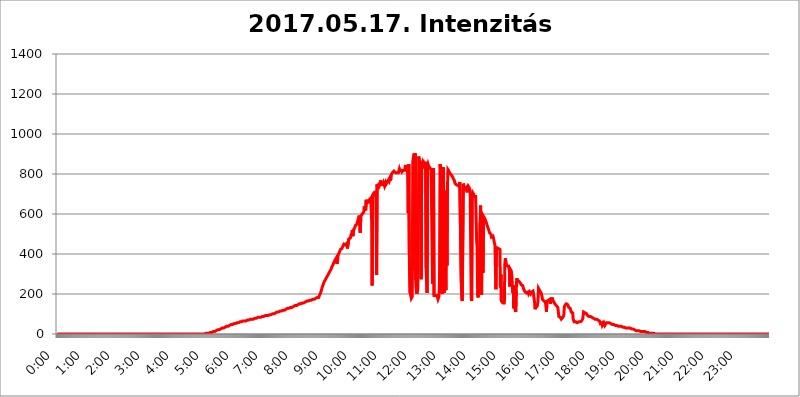
| Category | 2017.05.17. Intenzitás [W/m^2] |
|---|---|
| 0.0 | 0 |
| 0.0006944444444444445 | 0 |
| 0.001388888888888889 | 0 |
| 0.0020833333333333333 | 0 |
| 0.002777777777777778 | 0 |
| 0.003472222222222222 | 0 |
| 0.004166666666666667 | 0 |
| 0.004861111111111111 | 0 |
| 0.005555555555555556 | 0 |
| 0.0062499999999999995 | 0 |
| 0.006944444444444444 | 0 |
| 0.007638888888888889 | 0 |
| 0.008333333333333333 | 0 |
| 0.009027777777777779 | 0 |
| 0.009722222222222222 | 0 |
| 0.010416666666666666 | 0 |
| 0.011111111111111112 | 0 |
| 0.011805555555555555 | 0 |
| 0.012499999999999999 | 0 |
| 0.013194444444444444 | 0 |
| 0.013888888888888888 | 0 |
| 0.014583333333333332 | 0 |
| 0.015277777777777777 | 0 |
| 0.015972222222222224 | 0 |
| 0.016666666666666666 | 0 |
| 0.017361111111111112 | 0 |
| 0.018055555555555557 | 0 |
| 0.01875 | 0 |
| 0.019444444444444445 | 0 |
| 0.02013888888888889 | 0 |
| 0.020833333333333332 | 0 |
| 0.02152777777777778 | 0 |
| 0.022222222222222223 | 0 |
| 0.02291666666666667 | 0 |
| 0.02361111111111111 | 0 |
| 0.024305555555555556 | 0 |
| 0.024999999999999998 | 0 |
| 0.025694444444444447 | 0 |
| 0.02638888888888889 | 0 |
| 0.027083333333333334 | 0 |
| 0.027777777777777776 | 0 |
| 0.02847222222222222 | 0 |
| 0.029166666666666664 | 0 |
| 0.029861111111111113 | 0 |
| 0.030555555555555555 | 0 |
| 0.03125 | 0 |
| 0.03194444444444445 | 0 |
| 0.03263888888888889 | 0 |
| 0.03333333333333333 | 0 |
| 0.034027777777777775 | 0 |
| 0.034722222222222224 | 0 |
| 0.035416666666666666 | 0 |
| 0.036111111111111115 | 0 |
| 0.03680555555555556 | 0 |
| 0.0375 | 0 |
| 0.03819444444444444 | 0 |
| 0.03888888888888889 | 0 |
| 0.03958333333333333 | 0 |
| 0.04027777777777778 | 0 |
| 0.04097222222222222 | 0 |
| 0.041666666666666664 | 0 |
| 0.042361111111111106 | 0 |
| 0.04305555555555556 | 0 |
| 0.043750000000000004 | 0 |
| 0.044444444444444446 | 0 |
| 0.04513888888888889 | 0 |
| 0.04583333333333334 | 0 |
| 0.04652777777777778 | 0 |
| 0.04722222222222222 | 0 |
| 0.04791666666666666 | 0 |
| 0.04861111111111111 | 0 |
| 0.049305555555555554 | 0 |
| 0.049999999999999996 | 0 |
| 0.05069444444444445 | 0 |
| 0.051388888888888894 | 0 |
| 0.052083333333333336 | 0 |
| 0.05277777777777778 | 0 |
| 0.05347222222222222 | 0 |
| 0.05416666666666667 | 0 |
| 0.05486111111111111 | 0 |
| 0.05555555555555555 | 0 |
| 0.05625 | 0 |
| 0.05694444444444444 | 0 |
| 0.057638888888888885 | 0 |
| 0.05833333333333333 | 0 |
| 0.05902777777777778 | 0 |
| 0.059722222222222225 | 0 |
| 0.06041666666666667 | 0 |
| 0.061111111111111116 | 0 |
| 0.06180555555555556 | 0 |
| 0.0625 | 0 |
| 0.06319444444444444 | 0 |
| 0.06388888888888888 | 0 |
| 0.06458333333333334 | 0 |
| 0.06527777777777778 | 0 |
| 0.06597222222222222 | 0 |
| 0.06666666666666667 | 0 |
| 0.06736111111111111 | 0 |
| 0.06805555555555555 | 0 |
| 0.06874999999999999 | 0 |
| 0.06944444444444443 | 0 |
| 0.07013888888888889 | 0 |
| 0.07083333333333333 | 0 |
| 0.07152777777777779 | 0 |
| 0.07222222222222223 | 0 |
| 0.07291666666666667 | 0 |
| 0.07361111111111111 | 0 |
| 0.07430555555555556 | 0 |
| 0.075 | 0 |
| 0.07569444444444444 | 0 |
| 0.0763888888888889 | 0 |
| 0.07708333333333334 | 0 |
| 0.07777777777777778 | 0 |
| 0.07847222222222222 | 0 |
| 0.07916666666666666 | 0 |
| 0.0798611111111111 | 0 |
| 0.08055555555555556 | 0 |
| 0.08125 | 0 |
| 0.08194444444444444 | 0 |
| 0.08263888888888889 | 0 |
| 0.08333333333333333 | 0 |
| 0.08402777777777777 | 0 |
| 0.08472222222222221 | 0 |
| 0.08541666666666665 | 0 |
| 0.08611111111111112 | 0 |
| 0.08680555555555557 | 0 |
| 0.08750000000000001 | 0 |
| 0.08819444444444445 | 0 |
| 0.08888888888888889 | 0 |
| 0.08958333333333333 | 0 |
| 0.09027777777777778 | 0 |
| 0.09097222222222222 | 0 |
| 0.09166666666666667 | 0 |
| 0.09236111111111112 | 0 |
| 0.09305555555555556 | 0 |
| 0.09375 | 0 |
| 0.09444444444444444 | 0 |
| 0.09513888888888888 | 0 |
| 0.09583333333333333 | 0 |
| 0.09652777777777777 | 0 |
| 0.09722222222222222 | 0 |
| 0.09791666666666667 | 0 |
| 0.09861111111111111 | 0 |
| 0.09930555555555555 | 0 |
| 0.09999999999999999 | 0 |
| 0.10069444444444443 | 0 |
| 0.1013888888888889 | 0 |
| 0.10208333333333335 | 0 |
| 0.10277777777777779 | 0 |
| 0.10347222222222223 | 0 |
| 0.10416666666666667 | 0 |
| 0.10486111111111111 | 0 |
| 0.10555555555555556 | 0 |
| 0.10625 | 0 |
| 0.10694444444444444 | 0 |
| 0.1076388888888889 | 0 |
| 0.10833333333333334 | 0 |
| 0.10902777777777778 | 0 |
| 0.10972222222222222 | 0 |
| 0.1111111111111111 | 0 |
| 0.11180555555555556 | 0 |
| 0.11180555555555556 | 0 |
| 0.1125 | 0 |
| 0.11319444444444444 | 0 |
| 0.11388888888888889 | 0 |
| 0.11458333333333333 | 0 |
| 0.11527777777777777 | 0 |
| 0.11597222222222221 | 0 |
| 0.11666666666666665 | 0 |
| 0.1173611111111111 | 0 |
| 0.11805555555555557 | 0 |
| 0.11944444444444445 | 0 |
| 0.12013888888888889 | 0 |
| 0.12083333333333333 | 0 |
| 0.12152777777777778 | 0 |
| 0.12222222222222223 | 0 |
| 0.12291666666666667 | 0 |
| 0.12291666666666667 | 0 |
| 0.12361111111111112 | 0 |
| 0.12430555555555556 | 0 |
| 0.125 | 0 |
| 0.12569444444444444 | 0 |
| 0.12638888888888888 | 0 |
| 0.12708333333333333 | 0 |
| 0.16875 | 0 |
| 0.12847222222222224 | 0 |
| 0.12916666666666668 | 0 |
| 0.12986111111111112 | 0 |
| 0.13055555555555556 | 0 |
| 0.13125 | 0 |
| 0.13194444444444445 | 0 |
| 0.1326388888888889 | 0 |
| 0.13333333333333333 | 0 |
| 0.13402777777777777 | 0 |
| 0.13402777777777777 | 0 |
| 0.13472222222222222 | 0 |
| 0.13541666666666666 | 0 |
| 0.1361111111111111 | 0 |
| 0.13749999999999998 | 0 |
| 0.13819444444444443 | 0 |
| 0.1388888888888889 | 0 |
| 0.13958333333333334 | 0 |
| 0.14027777777777778 | 0 |
| 0.14097222222222222 | 0 |
| 0.14166666666666666 | 0 |
| 0.1423611111111111 | 0 |
| 0.14305555555555557 | 0 |
| 0.14375000000000002 | 0 |
| 0.14444444444444446 | 0 |
| 0.1451388888888889 | 0 |
| 0.1451388888888889 | 0 |
| 0.14652777777777778 | 0 |
| 0.14722222222222223 | 0 |
| 0.14791666666666667 | 0 |
| 0.1486111111111111 | 0 |
| 0.14930555555555555 | 0 |
| 0.15 | 0 |
| 0.15069444444444444 | 0 |
| 0.15138888888888888 | 0 |
| 0.15208333333333332 | 0 |
| 0.15277777777777776 | 0 |
| 0.15347222222222223 | 0 |
| 0.15416666666666667 | 0 |
| 0.15486111111111112 | 0 |
| 0.15555555555555556 | 0 |
| 0.15625 | 0 |
| 0.15694444444444444 | 0 |
| 0.15763888888888888 | 0 |
| 0.15833333333333333 | 0 |
| 0.15902777777777777 | 0 |
| 0.15972222222222224 | 0 |
| 0.16041666666666668 | 0 |
| 0.16111111111111112 | 0 |
| 0.16180555555555556 | 0 |
| 0.1625 | 0 |
| 0.16319444444444445 | 0 |
| 0.1638888888888889 | 0 |
| 0.16458333333333333 | 0 |
| 0.16527777777777777 | 0 |
| 0.16597222222222222 | 0 |
| 0.16666666666666666 | 0 |
| 0.1673611111111111 | 0 |
| 0.16805555555555554 | 0 |
| 0.16874999999999998 | 0 |
| 0.16944444444444443 | 0 |
| 0.17013888888888887 | 0 |
| 0.1708333333333333 | 0 |
| 0.17152777777777775 | 0 |
| 0.17222222222222225 | 0 |
| 0.1729166666666667 | 0 |
| 0.17361111111111113 | 0 |
| 0.17430555555555557 | 0 |
| 0.17500000000000002 | 0 |
| 0.17569444444444446 | 0 |
| 0.1763888888888889 | 0 |
| 0.17708333333333334 | 0 |
| 0.17777777777777778 | 0 |
| 0.17847222222222223 | 0 |
| 0.17916666666666667 | 0 |
| 0.1798611111111111 | 0 |
| 0.18055555555555555 | 0 |
| 0.18125 | 0 |
| 0.18194444444444444 | 0 |
| 0.1826388888888889 | 0 |
| 0.18333333333333335 | 0 |
| 0.1840277777777778 | 0 |
| 0.18472222222222223 | 0 |
| 0.18541666666666667 | 0 |
| 0.18611111111111112 | 0 |
| 0.18680555555555556 | 0 |
| 0.1875 | 0 |
| 0.18819444444444444 | 0 |
| 0.18888888888888888 | 0 |
| 0.18958333333333333 | 0 |
| 0.19027777777777777 | 0 |
| 0.1909722222222222 | 0 |
| 0.19166666666666665 | 0 |
| 0.19236111111111112 | 0 |
| 0.19305555555555554 | 0 |
| 0.19375 | 0 |
| 0.19444444444444445 | 0 |
| 0.1951388888888889 | 0 |
| 0.19583333333333333 | 0 |
| 0.19652777777777777 | 0 |
| 0.19722222222222222 | 0 |
| 0.19791666666666666 | 0 |
| 0.1986111111111111 | 0 |
| 0.19930555555555554 | 0 |
| 0.19999999999999998 | 0 |
| 0.20069444444444443 | 0 |
| 0.20138888888888887 | 0 |
| 0.2020833333333333 | 0 |
| 0.2027777777777778 | 0 |
| 0.2034722222222222 | 0 |
| 0.2041666666666667 | 0 |
| 0.20486111111111113 | 0 |
| 0.20555555555555557 | 0 |
| 0.20625000000000002 | 0 |
| 0.20694444444444446 | 0 |
| 0.2076388888888889 | 3.525 |
| 0.20833333333333334 | 3.525 |
| 0.20902777777777778 | 3.525 |
| 0.20972222222222223 | 3.525 |
| 0.21041666666666667 | 3.525 |
| 0.2111111111111111 | 3.525 |
| 0.21180555555555555 | 3.525 |
| 0.2125 | 3.525 |
| 0.21319444444444444 | 3.525 |
| 0.2138888888888889 | 3.525 |
| 0.21458333333333335 | 7.887 |
| 0.2152777777777778 | 7.887 |
| 0.21597222222222223 | 7.887 |
| 0.21666666666666667 | 7.887 |
| 0.21736111111111112 | 7.887 |
| 0.21805555555555556 | 7.887 |
| 0.21875 | 12.257 |
| 0.21944444444444444 | 12.257 |
| 0.22013888888888888 | 12.257 |
| 0.22083333333333333 | 12.257 |
| 0.22152777777777777 | 16.636 |
| 0.2222222222222222 | 12.257 |
| 0.22291666666666665 | 16.636 |
| 0.2236111111111111 | 16.636 |
| 0.22430555555555556 | 21.024 |
| 0.225 | 21.024 |
| 0.22569444444444445 | 21.024 |
| 0.2263888888888889 | 21.024 |
| 0.22708333333333333 | 21.024 |
| 0.22777777777777777 | 21.024 |
| 0.22847222222222222 | 25.419 |
| 0.22916666666666666 | 25.419 |
| 0.2298611111111111 | 25.419 |
| 0.23055555555555554 | 25.419 |
| 0.23124999999999998 | 29.823 |
| 0.23194444444444443 | 29.823 |
| 0.23263888888888887 | 29.823 |
| 0.2333333333333333 | 29.823 |
| 0.2340277777777778 | 29.823 |
| 0.2347222222222222 | 34.234 |
| 0.2354166666666667 | 34.234 |
| 0.23611111111111113 | 34.234 |
| 0.23680555555555557 | 38.653 |
| 0.23750000000000002 | 38.653 |
| 0.23819444444444446 | 38.653 |
| 0.2388888888888889 | 38.653 |
| 0.23958333333333334 | 38.653 |
| 0.24027777777777778 | 38.653 |
| 0.24097222222222223 | 43.079 |
| 0.24166666666666667 | 43.079 |
| 0.2423611111111111 | 43.079 |
| 0.24305555555555555 | 43.079 |
| 0.24375 | 47.511 |
| 0.24444444444444446 | 47.511 |
| 0.24513888888888888 | 47.511 |
| 0.24583333333333335 | 47.511 |
| 0.2465277777777778 | 47.511 |
| 0.24722222222222223 | 47.511 |
| 0.24791666666666667 | 51.951 |
| 0.24861111111111112 | 51.951 |
| 0.24930555555555556 | 51.951 |
| 0.25 | 51.951 |
| 0.25069444444444444 | 56.398 |
| 0.2513888888888889 | 56.398 |
| 0.2520833333333333 | 56.398 |
| 0.25277777777777777 | 56.398 |
| 0.2534722222222222 | 56.398 |
| 0.25416666666666665 | 56.398 |
| 0.2548611111111111 | 56.398 |
| 0.2555555555555556 | 56.398 |
| 0.25625000000000003 | 60.85 |
| 0.2569444444444445 | 60.85 |
| 0.2576388888888889 | 60.85 |
| 0.25833333333333336 | 60.85 |
| 0.2590277777777778 | 60.85 |
| 0.25972222222222224 | 65.31 |
| 0.2604166666666667 | 65.31 |
| 0.2611111111111111 | 65.31 |
| 0.26180555555555557 | 65.31 |
| 0.2625 | 65.31 |
| 0.26319444444444445 | 65.31 |
| 0.2638888888888889 | 65.31 |
| 0.26458333333333334 | 65.31 |
| 0.2652777777777778 | 65.31 |
| 0.2659722222222222 | 69.775 |
| 0.26666666666666666 | 69.775 |
| 0.2673611111111111 | 69.775 |
| 0.26805555555555555 | 69.775 |
| 0.26875 | 69.775 |
| 0.26944444444444443 | 69.775 |
| 0.2701388888888889 | 69.775 |
| 0.2708333333333333 | 74.246 |
| 0.27152777777777776 | 74.246 |
| 0.2722222222222222 | 74.246 |
| 0.27291666666666664 | 74.246 |
| 0.2736111111111111 | 74.246 |
| 0.2743055555555555 | 74.246 |
| 0.27499999999999997 | 74.246 |
| 0.27569444444444446 | 74.246 |
| 0.27638888888888885 | 78.722 |
| 0.27708333333333335 | 78.722 |
| 0.2777777777777778 | 78.722 |
| 0.27847222222222223 | 78.722 |
| 0.2791666666666667 | 78.722 |
| 0.2798611111111111 | 78.722 |
| 0.28055555555555556 | 83.205 |
| 0.28125 | 83.205 |
| 0.28194444444444444 | 83.205 |
| 0.2826388888888889 | 83.205 |
| 0.2833333333333333 | 83.205 |
| 0.28402777777777777 | 83.205 |
| 0.2847222222222222 | 83.205 |
| 0.28541666666666665 | 83.205 |
| 0.28611111111111115 | 83.205 |
| 0.28680555555555554 | 87.692 |
| 0.28750000000000003 | 87.692 |
| 0.2881944444444445 | 87.692 |
| 0.2888888888888889 | 87.692 |
| 0.28958333333333336 | 87.692 |
| 0.2902777777777778 | 87.692 |
| 0.29097222222222224 | 92.184 |
| 0.2916666666666667 | 92.184 |
| 0.2923611111111111 | 92.184 |
| 0.29305555555555557 | 92.184 |
| 0.29375 | 92.184 |
| 0.29444444444444445 | 92.184 |
| 0.2951388888888889 | 92.184 |
| 0.29583333333333334 | 92.184 |
| 0.2965277777777778 | 92.184 |
| 0.2972222222222222 | 96.682 |
| 0.29791666666666666 | 96.682 |
| 0.2986111111111111 | 96.682 |
| 0.29930555555555555 | 96.682 |
| 0.3 | 96.682 |
| 0.30069444444444443 | 96.682 |
| 0.3013888888888889 | 101.184 |
| 0.3020833333333333 | 101.184 |
| 0.30277777777777776 | 101.184 |
| 0.3034722222222222 | 101.184 |
| 0.30416666666666664 | 101.184 |
| 0.3048611111111111 | 101.184 |
| 0.3055555555555555 | 105.69 |
| 0.30624999999999997 | 105.69 |
| 0.3069444444444444 | 105.69 |
| 0.3076388888888889 | 105.69 |
| 0.30833333333333335 | 110.201 |
| 0.3090277777777778 | 110.201 |
| 0.30972222222222223 | 110.201 |
| 0.3104166666666667 | 110.201 |
| 0.3111111111111111 | 110.201 |
| 0.31180555555555556 | 110.201 |
| 0.3125 | 114.716 |
| 0.31319444444444444 | 114.716 |
| 0.3138888888888889 | 114.716 |
| 0.3145833333333333 | 114.716 |
| 0.31527777777777777 | 114.716 |
| 0.3159722222222222 | 114.716 |
| 0.31666666666666665 | 119.235 |
| 0.31736111111111115 | 119.235 |
| 0.31805555555555554 | 119.235 |
| 0.31875000000000003 | 119.235 |
| 0.3194444444444445 | 119.235 |
| 0.3201388888888889 | 123.758 |
| 0.32083333333333336 | 123.758 |
| 0.3215277777777778 | 123.758 |
| 0.32222222222222224 | 123.758 |
| 0.3229166666666667 | 128.284 |
| 0.3236111111111111 | 128.284 |
| 0.32430555555555557 | 128.284 |
| 0.325 | 128.284 |
| 0.32569444444444445 | 128.284 |
| 0.3263888888888889 | 128.284 |
| 0.32708333333333334 | 132.814 |
| 0.3277777777777778 | 132.814 |
| 0.3284722222222222 | 132.814 |
| 0.32916666666666666 | 132.814 |
| 0.3298611111111111 | 137.347 |
| 0.33055555555555555 | 137.347 |
| 0.33125 | 137.347 |
| 0.33194444444444443 | 137.347 |
| 0.3326388888888889 | 137.347 |
| 0.3333333333333333 | 141.884 |
| 0.3340277777777778 | 141.884 |
| 0.3347222222222222 | 141.884 |
| 0.3354166666666667 | 141.884 |
| 0.3361111111111111 | 146.423 |
| 0.3368055555555556 | 146.423 |
| 0.33749999999999997 | 146.423 |
| 0.33819444444444446 | 146.423 |
| 0.33888888888888885 | 146.423 |
| 0.33958333333333335 | 150.964 |
| 0.34027777777777773 | 150.964 |
| 0.34097222222222223 | 150.964 |
| 0.3416666666666666 | 150.964 |
| 0.3423611111111111 | 150.964 |
| 0.3430555555555555 | 155.509 |
| 0.34375 | 155.509 |
| 0.3444444444444445 | 155.509 |
| 0.3451388888888889 | 155.509 |
| 0.3458333333333334 | 155.509 |
| 0.34652777777777777 | 155.509 |
| 0.34722222222222227 | 160.056 |
| 0.34791666666666665 | 160.056 |
| 0.34861111111111115 | 160.056 |
| 0.34930555555555554 | 160.056 |
| 0.35000000000000003 | 164.605 |
| 0.3506944444444444 | 164.605 |
| 0.3513888888888889 | 164.605 |
| 0.3520833333333333 | 164.605 |
| 0.3527777777777778 | 164.605 |
| 0.3534722222222222 | 164.605 |
| 0.3541666666666667 | 169.156 |
| 0.3548611111111111 | 169.156 |
| 0.35555555555555557 | 169.156 |
| 0.35625 | 169.156 |
| 0.35694444444444445 | 173.709 |
| 0.3576388888888889 | 173.709 |
| 0.35833333333333334 | 173.709 |
| 0.3590277777777778 | 173.709 |
| 0.3597222222222222 | 173.709 |
| 0.36041666666666666 | 173.709 |
| 0.3611111111111111 | 178.264 |
| 0.36180555555555555 | 178.264 |
| 0.3625 | 178.264 |
| 0.36319444444444443 | 178.264 |
| 0.3638888888888889 | 178.264 |
| 0.3645833333333333 | 182.82 |
| 0.3652777777777778 | 182.82 |
| 0.3659722222222222 | 182.82 |
| 0.3666666666666667 | 182.82 |
| 0.3673611111111111 | 187.378 |
| 0.3680555555555556 | 196.497 |
| 0.36874999999999997 | 201.058 |
| 0.36944444444444446 | 205.62 |
| 0.37013888888888885 | 214.746 |
| 0.37083333333333335 | 223.873 |
| 0.37152777777777773 | 233 |
| 0.37222222222222223 | 237.564 |
| 0.3729166666666666 | 246.689 |
| 0.3736111111111111 | 251.251 |
| 0.3743055555555555 | 260.373 |
| 0.375 | 264.932 |
| 0.3756944444444445 | 269.49 |
| 0.3763888888888889 | 274.047 |
| 0.3770833333333334 | 278.603 |
| 0.37777777777777777 | 283.156 |
| 0.37847222222222227 | 287.709 |
| 0.37916666666666665 | 292.259 |
| 0.37986111111111115 | 296.808 |
| 0.38055555555555554 | 301.354 |
| 0.38125000000000003 | 305.898 |
| 0.3819444444444444 | 310.44 |
| 0.3826388888888889 | 314.98 |
| 0.3833333333333333 | 319.517 |
| 0.3840277777777778 | 324.052 |
| 0.3847222222222222 | 328.584 |
| 0.3854166666666667 | 337.639 |
| 0.3861111111111111 | 342.162 |
| 0.38680555555555557 | 346.682 |
| 0.3875 | 351.198 |
| 0.38819444444444445 | 360.221 |
| 0.3888888888888889 | 364.728 |
| 0.38958333333333334 | 369.23 |
| 0.3902777777777778 | 373.729 |
| 0.3909722222222222 | 378.224 |
| 0.39166666666666666 | 378.224 |
| 0.3923611111111111 | 351.198 |
| 0.39305555555555555 | 360.221 |
| 0.39375 | 387.202 |
| 0.39444444444444443 | 400.638 |
| 0.3951388888888889 | 405.108 |
| 0.3958333333333333 | 409.574 |
| 0.3965277777777778 | 414.035 |
| 0.3972222222222222 | 422.943 |
| 0.3979166666666667 | 422.943 |
| 0.3986111111111111 | 422.943 |
| 0.3993055555555556 | 427.39 |
| 0.39999999999999997 | 431.833 |
| 0.40069444444444446 | 440.702 |
| 0.40138888888888885 | 440.702 |
| 0.40208333333333335 | 449.551 |
| 0.40277777777777773 | 445.129 |
| 0.40347222222222223 | 449.551 |
| 0.4041666666666666 | 445.129 |
| 0.4048611111111111 | 449.551 |
| 0.4055555555555555 | 449.551 |
| 0.40625 | 453.968 |
| 0.4069444444444445 | 427.39 |
| 0.4076388888888889 | 431.833 |
| 0.4083333333333334 | 422.943 |
| 0.40902777777777777 | 475.972 |
| 0.40972222222222227 | 471.582 |
| 0.41041666666666665 | 475.972 |
| 0.41111111111111115 | 480.356 |
| 0.41180555555555554 | 493.475 |
| 0.41250000000000003 | 497.836 |
| 0.4131944444444444 | 506.542 |
| 0.4138888888888889 | 519.555 |
| 0.4145833333333333 | 489.108 |
| 0.4152777777777778 | 489.108 |
| 0.4159722222222222 | 523.88 |
| 0.4166666666666667 | 523.88 |
| 0.4173611111111111 | 532.513 |
| 0.41805555555555557 | 541.121 |
| 0.41875 | 545.416 |
| 0.41944444444444445 | 545.416 |
| 0.4201388888888889 | 549.704 |
| 0.42083333333333334 | 558.261 |
| 0.4215277777777778 | 566.793 |
| 0.4222222222222222 | 575.299 |
| 0.42291666666666666 | 583.779 |
| 0.4236111111111111 | 592.233 |
| 0.42430555555555555 | 596.45 |
| 0.425 | 506.542 |
| 0.42569444444444443 | 583.779 |
| 0.4263888888888889 | 592.233 |
| 0.4270833333333333 | 592.233 |
| 0.4277777777777778 | 600.661 |
| 0.4284722222222222 | 600.661 |
| 0.4291666666666667 | 600.661 |
| 0.4298611111111111 | 609.062 |
| 0.4305555555555556 | 638.256 |
| 0.43124999999999997 | 634.105 |
| 0.43194444444444446 | 634.105 |
| 0.43263888888888885 | 617.436 |
| 0.43333333333333335 | 671.22 |
| 0.43402777777777773 | 654.791 |
| 0.43472222222222223 | 658.909 |
| 0.4354166666666666 | 658.909 |
| 0.4361111111111111 | 658.909 |
| 0.4368055555555555 | 663.019 |
| 0.4375 | 671.22 |
| 0.4381944444444445 | 671.22 |
| 0.4388888888888889 | 671.22 |
| 0.4395833333333334 | 679.395 |
| 0.44027777777777777 | 625.784 |
| 0.44097222222222227 | 566.793 |
| 0.44166666666666665 | 242.127 |
| 0.44236111111111115 | 695.666 |
| 0.44305555555555554 | 695.666 |
| 0.44375000000000003 | 703.762 |
| 0.4444444444444444 | 703.762 |
| 0.4451388888888889 | 699.717 |
| 0.4458333333333333 | 695.666 |
| 0.4465277777777778 | 699.717 |
| 0.4472222222222222 | 715.858 |
| 0.4479166666666667 | 296.808 |
| 0.4486111111111111 | 747.834 |
| 0.44930555555555557 | 727.896 |
| 0.45 | 731.896 |
| 0.45069444444444445 | 735.89 |
| 0.4513888888888889 | 755.766 |
| 0.45208333333333334 | 747.834 |
| 0.4527777777777778 | 747.834 |
| 0.4534722222222222 | 767.62 |
| 0.45416666666666666 | 755.766 |
| 0.4548611111111111 | 747.834 |
| 0.45555555555555555 | 747.834 |
| 0.45625 | 743.859 |
| 0.45694444444444443 | 747.834 |
| 0.4576388888888889 | 755.766 |
| 0.4583333333333333 | 751.803 |
| 0.4590277777777778 | 739.877 |
| 0.4597222222222222 | 743.859 |
| 0.4604166666666667 | 755.766 |
| 0.4611111111111111 | 747.834 |
| 0.4618055555555556 | 751.803 |
| 0.46249999999999997 | 751.803 |
| 0.46319444444444446 | 759.723 |
| 0.46388888888888885 | 767.62 |
| 0.46458333333333335 | 763.674 |
| 0.46527777777777773 | 775.492 |
| 0.46597222222222223 | 767.62 |
| 0.4666666666666666 | 775.492 |
| 0.4673611111111111 | 767.62 |
| 0.4680555555555555 | 779.42 |
| 0.46875 | 798.974 |
| 0.4694444444444445 | 802.868 |
| 0.4701388888888889 | 806.757 |
| 0.4708333333333334 | 810.641 |
| 0.47152777777777777 | 810.641 |
| 0.47222222222222227 | 814.519 |
| 0.47291666666666665 | 814.519 |
| 0.47361111111111115 | 810.641 |
| 0.47430555555555554 | 806.757 |
| 0.47500000000000003 | 802.868 |
| 0.4756944444444444 | 810.641 |
| 0.4763888888888889 | 806.757 |
| 0.4770833333333333 | 806.757 |
| 0.4777777777777778 | 810.641 |
| 0.4784722222222222 | 806.757 |
| 0.4791666666666667 | 802.868 |
| 0.4798611111111111 | 826.123 |
| 0.48055555555555557 | 818.392 |
| 0.48125 | 822.26 |
| 0.48194444444444445 | 822.26 |
| 0.4826388888888889 | 818.392 |
| 0.48333333333333334 | 810.641 |
| 0.4840277777777778 | 806.757 |
| 0.4847222222222222 | 810.641 |
| 0.48541666666666666 | 818.392 |
| 0.4861111111111111 | 822.26 |
| 0.48680555555555555 | 822.26 |
| 0.4875 | 818.392 |
| 0.48819444444444443 | 845.365 |
| 0.4888888888888889 | 829.981 |
| 0.4895833333333333 | 826.123 |
| 0.4902777777777778 | 829.981 |
| 0.4909722222222222 | 814.519 |
| 0.4916666666666667 | 826.123 |
| 0.4923611111111111 | 604.864 |
| 0.4930555555555556 | 849.199 |
| 0.49374999999999997 | 405.108 |
| 0.49444444444444446 | 210.182 |
| 0.49513888888888885 | 210.182 |
| 0.49583333333333335 | 191.937 |
| 0.49652777777777773 | 178.264 |
| 0.49722222222222223 | 178.264 |
| 0.4979166666666666 | 187.378 |
| 0.4986111111111111 | 860.676 |
| 0.4993055555555555 | 879.719 |
| 0.5 | 883.516 |
| 0.5006944444444444 | 902.447 |
| 0.5013888888888889 | 314.98 |
| 0.5020833333333333 | 902.447 |
| 0.5027777777777778 | 269.49 |
| 0.5034722222222222 | 219.309 |
| 0.5041666666666667 | 201.058 |
| 0.5048611111111111 | 205.62 |
| 0.5055555555555555 | 219.309 |
| 0.50625 | 314.98 |
| 0.5069444444444444 | 887.309 |
| 0.5076388888888889 | 872.114 |
| 0.5083333333333333 | 868.305 |
| 0.5090277777777777 | 856.855 |
| 0.5097222222222222 | 849.199 |
| 0.5104166666666666 | 274.047 |
| 0.5111111111111112 | 860.676 |
| 0.5118055555555555 | 853.029 |
| 0.5125000000000001 | 860.676 |
| 0.5131944444444444 | 860.676 |
| 0.513888888888889 | 845.365 |
| 0.5145833333333333 | 853.029 |
| 0.5152777777777778 | 853.029 |
| 0.5159722222222222 | 841.526 |
| 0.5166666666666667 | 860.676 |
| 0.517361111111111 | 328.584 |
| 0.5180555555555556 | 251.251 |
| 0.5187499999999999 | 205.62 |
| 0.5194444444444445 | 837.682 |
| 0.5201388888888888 | 849.199 |
| 0.5208333333333334 | 841.526 |
| 0.5215277777777778 | 841.526 |
| 0.5222222222222223 | 837.682 |
| 0.5229166666666667 | 829.981 |
| 0.5236111111111111 | 826.123 |
| 0.5243055555555556 | 822.26 |
| 0.525 | 818.392 |
| 0.5256944444444445 | 822.26 |
| 0.5263888888888889 | 251.251 |
| 0.5270833333333333 | 783.342 |
| 0.5277777777777778 | 829.981 |
| 0.5284722222222222 | 191.937 |
| 0.5291666666666667 | 187.378 |
| 0.5298611111111111 | 187.378 |
| 0.5305555555555556 | 191.937 |
| 0.53125 | 196.497 |
| 0.5319444444444444 | 196.497 |
| 0.5326388888888889 | 191.937 |
| 0.5333333333333333 | 182.82 |
| 0.5340277777777778 | 173.709 |
| 0.5347222222222222 | 173.709 |
| 0.5354166666666667 | 187.378 |
| 0.5361111111111111 | 269.49 |
| 0.5368055555555555 | 849.199 |
| 0.5375 | 853.029 |
| 0.5381944444444444 | 826.123 |
| 0.5388888888888889 | 210.182 |
| 0.5395833333333333 | 205.62 |
| 0.5402777777777777 | 201.058 |
| 0.5409722222222222 | 328.584 |
| 0.5416666666666666 | 833.834 |
| 0.5423611111111112 | 833.834 |
| 0.5430555555555555 | 205.62 |
| 0.5437500000000001 | 324.052 |
| 0.5444444444444444 | 296.808 |
| 0.545138888888889 | 219.309 |
| 0.5458333333333333 | 715.858 |
| 0.5465277777777778 | 342.162 |
| 0.5472222222222222 | 719.877 |
| 0.5479166666666667 | 822.26 |
| 0.548611111111111 | 822.26 |
| 0.5493055555555556 | 814.519 |
| 0.5499999999999999 | 810.641 |
| 0.5506944444444445 | 802.868 |
| 0.5513888888888888 | 798.974 |
| 0.5520833333333334 | 798.974 |
| 0.5527777777777778 | 795.074 |
| 0.5534722222222223 | 791.169 |
| 0.5541666666666667 | 791.169 |
| 0.5548611111111111 | 783.342 |
| 0.5555555555555556 | 775.492 |
| 0.55625 | 775.492 |
| 0.5569444444444445 | 767.62 |
| 0.5576388888888889 | 755.766 |
| 0.5583333333333333 | 751.803 |
| 0.5590277777777778 | 747.834 |
| 0.5597222222222222 | 747.834 |
| 0.5604166666666667 | 747.834 |
| 0.5611111111111111 | 743.859 |
| 0.5618055555555556 | 743.859 |
| 0.5625 | 743.859 |
| 0.5631944444444444 | 739.877 |
| 0.5638888888888889 | 747.834 |
| 0.5645833333333333 | 759.723 |
| 0.5652777777777778 | 755.766 |
| 0.5659722222222222 | 759.723 |
| 0.5666666666666667 | 255.813 |
| 0.5673611111111111 | 178.264 |
| 0.5680555555555555 | 164.605 |
| 0.56875 | 164.605 |
| 0.5694444444444444 | 751.803 |
| 0.5701388888888889 | 743.859 |
| 0.5708333333333333 | 731.896 |
| 0.5715277777777777 | 723.889 |
| 0.5722222222222222 | 723.889 |
| 0.5729166666666666 | 727.896 |
| 0.5736111111111112 | 731.896 |
| 0.5743055555555555 | 727.896 |
| 0.5750000000000001 | 707.8 |
| 0.5756944444444444 | 731.896 |
| 0.576388888888889 | 739.877 |
| 0.5770833333333333 | 743.859 |
| 0.5777777777777778 | 731.896 |
| 0.5784722222222222 | 723.889 |
| 0.5791666666666667 | 711.832 |
| 0.579861111111111 | 711.832 |
| 0.5805555555555556 | 178.264 |
| 0.5812499999999999 | 164.605 |
| 0.5819444444444445 | 695.666 |
| 0.5826388888888888 | 707.8 |
| 0.5833333333333334 | 707.8 |
| 0.5840277777777778 | 699.717 |
| 0.5847222222222223 | 687.544 |
| 0.5854166666666667 | 691.608 |
| 0.5861111111111111 | 687.544 |
| 0.5868055555555556 | 687.544 |
| 0.5875 | 683.473 |
| 0.5881944444444445 | 467.187 |
| 0.5888888888888889 | 431.833 |
| 0.5895833333333333 | 191.937 |
| 0.5902777777777778 | 182.82 |
| 0.5909722222222222 | 187.378 |
| 0.5916666666666667 | 264.932 |
| 0.5923611111111111 | 219.309 |
| 0.5930555555555556 | 558.261 |
| 0.59375 | 642.4 |
| 0.5944444444444444 | 638.256 |
| 0.5951388888888889 | 196.497 |
| 0.5958333333333333 | 592.233 |
| 0.5965277777777778 | 346.682 |
| 0.5972222222222222 | 305.898 |
| 0.5979166666666667 | 588.009 |
| 0.5986111111111111 | 592.233 |
| 0.5993055555555555 | 583.779 |
| 0.6 | 575.299 |
| 0.6006944444444444 | 566.793 |
| 0.6013888888888889 | 566.793 |
| 0.6020833333333333 | 553.986 |
| 0.6027777777777777 | 558.261 |
| 0.6034722222222222 | 536.82 |
| 0.6041666666666666 | 536.82 |
| 0.6048611111111112 | 523.88 |
| 0.6055555555555555 | 523.88 |
| 0.6062500000000001 | 506.542 |
| 0.6069444444444444 | 506.542 |
| 0.607638888888889 | 502.192 |
| 0.6083333333333333 | 497.836 |
| 0.6090277777777778 | 484.735 |
| 0.6097222222222222 | 489.108 |
| 0.6104166666666667 | 489.108 |
| 0.611111111111111 | 489.108 |
| 0.6118055555555556 | 480.356 |
| 0.6124999999999999 | 467.187 |
| 0.6131944444444445 | 453.968 |
| 0.6138888888888888 | 445.129 |
| 0.6145833333333334 | 328.584 |
| 0.6152777777777778 | 223.873 |
| 0.6159722222222223 | 436.27 |
| 0.6166666666666667 | 422.943 |
| 0.6173611111111111 | 418.492 |
| 0.6180555555555556 | 418.492 |
| 0.61875 | 427.39 |
| 0.6194444444444445 | 427.39 |
| 0.6201388888888889 | 427.39 |
| 0.6208333333333333 | 422.943 |
| 0.6215277777777778 | 233 |
| 0.6222222222222222 | 296.808 |
| 0.6229166666666667 | 164.605 |
| 0.6236111111111111 | 164.605 |
| 0.6243055555555556 | 160.056 |
| 0.625 | 155.509 |
| 0.6256944444444444 | 155.509 |
| 0.6263888888888889 | 150.964 |
| 0.6270833333333333 | 155.509 |
| 0.6277777777777778 | 351.198 |
| 0.6284722222222222 | 378.224 |
| 0.6291666666666667 | 364.728 |
| 0.6298611111111111 | 351.198 |
| 0.6305555555555555 | 342.162 |
| 0.63125 | 342.162 |
| 0.6319444444444444 | 337.639 |
| 0.6326388888888889 | 337.639 |
| 0.6333333333333333 | 333.113 |
| 0.6340277777777777 | 324.052 |
| 0.6347222222222222 | 237.564 |
| 0.6354166666666666 | 324.052 |
| 0.6361111111111112 | 328.584 |
| 0.6368055555555555 | 314.98 |
| 0.6375000000000001 | 296.808 |
| 0.6381944444444444 | 296.808 |
| 0.638888888888889 | 205.62 |
| 0.6395833333333333 | 242.127 |
| 0.6402777777777778 | 128.284 |
| 0.6409722222222222 | 123.758 |
| 0.6416666666666667 | 242.127 |
| 0.642361111111111 | 119.235 |
| 0.6430555555555556 | 110.201 |
| 0.6437499999999999 | 214.746 |
| 0.6444444444444445 | 278.603 |
| 0.6451388888888888 | 269.49 |
| 0.6458333333333334 | 269.49 |
| 0.6465277777777778 | 264.932 |
| 0.6472222222222223 | 264.932 |
| 0.6479166666666667 | 260.373 |
| 0.6486111111111111 | 260.373 |
| 0.6493055555555556 | 255.813 |
| 0.65 | 251.251 |
| 0.6506944444444445 | 246.689 |
| 0.6513888888888889 | 251.251 |
| 0.6520833333333333 | 242.127 |
| 0.6527777777777778 | 242.127 |
| 0.6534722222222222 | 233 |
| 0.6541666666666667 | 223.873 |
| 0.6548611111111111 | 223.873 |
| 0.6555555555555556 | 219.309 |
| 0.65625 | 210.182 |
| 0.6569444444444444 | 210.182 |
| 0.6576388888888889 | 210.182 |
| 0.6583333333333333 | 205.62 |
| 0.6590277777777778 | 205.62 |
| 0.6597222222222222 | 205.62 |
| 0.6604166666666667 | 210.182 |
| 0.6611111111111111 | 201.058 |
| 0.6618055555555555 | 201.058 |
| 0.6625 | 210.182 |
| 0.6631944444444444 | 205.62 |
| 0.6638888888888889 | 201.058 |
| 0.6645833333333333 | 205.62 |
| 0.6652777777777777 | 210.182 |
| 0.6659722222222222 | 210.182 |
| 0.6666666666666666 | 214.746 |
| 0.6673611111111111 | 214.746 |
| 0.6680555555555556 | 210.182 |
| 0.6687500000000001 | 214.746 |
| 0.6694444444444444 | 160.056 |
| 0.6701388888888888 | 123.758 |
| 0.6708333333333334 | 132.814 |
| 0.6715277777777778 | 132.814 |
| 0.6722222222222222 | 137.347 |
| 0.6729166666666666 | 137.347 |
| 0.6736111111111112 | 146.423 |
| 0.6743055555555556 | 169.156 |
| 0.6749999999999999 | 228.436 |
| 0.6756944444444444 | 223.873 |
| 0.6763888888888889 | 223.873 |
| 0.6770833333333334 | 214.746 |
| 0.6777777777777777 | 214.746 |
| 0.6784722222222223 | 210.182 |
| 0.6791666666666667 | 201.058 |
| 0.6798611111111111 | 187.378 |
| 0.6805555555555555 | 173.709 |
| 0.68125 | 173.709 |
| 0.6819444444444445 | 169.156 |
| 0.6826388888888889 | 164.605 |
| 0.6833333333333332 | 164.605 |
| 0.6840277777777778 | 164.605 |
| 0.6847222222222222 | 160.056 |
| 0.6854166666666667 | 164.605 |
| 0.686111111111111 | 110.201 |
| 0.6868055555555556 | 164.605 |
| 0.6875 | 169.156 |
| 0.6881944444444444 | 169.156 |
| 0.688888888888889 | 169.156 |
| 0.6895833333333333 | 173.709 |
| 0.6902777777777778 | 173.709 |
| 0.6909722222222222 | 173.709 |
| 0.6916666666666668 | 150.964 |
| 0.6923611111111111 | 160.056 |
| 0.6930555555555555 | 164.605 |
| 0.69375 | 182.82 |
| 0.6944444444444445 | 173.709 |
| 0.6951388888888889 | 173.709 |
| 0.6958333333333333 | 169.156 |
| 0.6965277777777777 | 160.056 |
| 0.6972222222222223 | 155.509 |
| 0.6979166666666666 | 150.964 |
| 0.6986111111111111 | 150.964 |
| 0.6993055555555556 | 146.423 |
| 0.7000000000000001 | 141.884 |
| 0.7006944444444444 | 141.884 |
| 0.7013888888888888 | 137.347 |
| 0.7020833333333334 | 132.814 |
| 0.7027777777777778 | 128.284 |
| 0.7034722222222222 | 87.692 |
| 0.7041666666666666 | 83.205 |
| 0.7048611111111112 | 83.205 |
| 0.7055555555555556 | 83.205 |
| 0.7062499999999999 | 78.722 |
| 0.7069444444444444 | 74.246 |
| 0.7076388888888889 | 74.246 |
| 0.7083333333333334 | 78.722 |
| 0.7090277777777777 | 83.205 |
| 0.7097222222222223 | 83.205 |
| 0.7104166666666667 | 92.184 |
| 0.7111111111111111 | 132.814 |
| 0.7118055555555555 | 141.884 |
| 0.7125 | 146.423 |
| 0.7131944444444445 | 146.423 |
| 0.7138888888888889 | 150.964 |
| 0.7145833333333332 | 150.964 |
| 0.7152777777777778 | 150.964 |
| 0.7159722222222222 | 146.423 |
| 0.7166666666666667 | 141.884 |
| 0.717361111111111 | 132.814 |
| 0.7180555555555556 | 128.284 |
| 0.71875 | 128.284 |
| 0.7194444444444444 | 128.284 |
| 0.720138888888889 | 123.758 |
| 0.7208333333333333 | 110.201 |
| 0.7215277777777778 | 110.201 |
| 0.7222222222222222 | 110.201 |
| 0.7229166666666668 | 105.69 |
| 0.7236111111111111 | 74.246 |
| 0.7243055555555555 | 69.775 |
| 0.725 | 60.85 |
| 0.7256944444444445 | 60.85 |
| 0.7263888888888889 | 60.85 |
| 0.7270833333333333 | 60.85 |
| 0.7277777777777777 | 60.85 |
| 0.7284722222222223 | 56.398 |
| 0.7291666666666666 | 56.398 |
| 0.7298611111111111 | 56.398 |
| 0.7305555555555556 | 60.85 |
| 0.7312500000000001 | 60.85 |
| 0.7319444444444444 | 60.85 |
| 0.7326388888888888 | 60.85 |
| 0.7333333333333334 | 60.85 |
| 0.7340277777777778 | 60.85 |
| 0.7347222222222222 | 65.31 |
| 0.7354166666666666 | 65.31 |
| 0.7361111111111112 | 69.775 |
| 0.7368055555555556 | 74.246 |
| 0.7374999999999999 | 87.692 |
| 0.7381944444444444 | 110.201 |
| 0.7388888888888889 | 110.201 |
| 0.7395833333333334 | 110.201 |
| 0.7402777777777777 | 105.69 |
| 0.7409722222222223 | 105.69 |
| 0.7416666666666667 | 101.184 |
| 0.7423611111111111 | 101.184 |
| 0.7430555555555555 | 96.682 |
| 0.74375 | 92.184 |
| 0.7444444444444445 | 92.184 |
| 0.7451388888888889 | 92.184 |
| 0.7458333333333332 | 87.692 |
| 0.7465277777777778 | 87.692 |
| 0.7472222222222222 | 87.692 |
| 0.7479166666666667 | 87.692 |
| 0.748611111111111 | 83.205 |
| 0.7493055555555556 | 83.205 |
| 0.75 | 83.205 |
| 0.7506944444444444 | 83.205 |
| 0.751388888888889 | 83.205 |
| 0.7520833333333333 | 78.722 |
| 0.7527777777777778 | 78.722 |
| 0.7534722222222222 | 78.722 |
| 0.7541666666666668 | 74.246 |
| 0.7548611111111111 | 74.246 |
| 0.7555555555555555 | 74.246 |
| 0.75625 | 74.246 |
| 0.7569444444444445 | 74.246 |
| 0.7576388888888889 | 74.246 |
| 0.7583333333333333 | 69.775 |
| 0.7590277777777777 | 69.775 |
| 0.7597222222222223 | 69.775 |
| 0.7604166666666666 | 65.31 |
| 0.7611111111111111 | 60.85 |
| 0.7618055555555556 | 51.951 |
| 0.7625000000000001 | 47.511 |
| 0.7631944444444444 | 47.511 |
| 0.7638888888888888 | 56.398 |
| 0.7645833333333334 | 43.079 |
| 0.7652777777777778 | 43.079 |
| 0.7659722222222222 | 38.653 |
| 0.7666666666666666 | 56.398 |
| 0.7673611111111112 | 51.951 |
| 0.7680555555555556 | 43.079 |
| 0.7687499999999999 | 38.653 |
| 0.7694444444444444 | 47.511 |
| 0.7701388888888889 | 56.398 |
| 0.7708333333333334 | 56.398 |
| 0.7715277777777777 | 56.398 |
| 0.7722222222222223 | 56.398 |
| 0.7729166666666667 | 56.398 |
| 0.7736111111111111 | 56.398 |
| 0.7743055555555555 | 56.398 |
| 0.775 | 51.951 |
| 0.7756944444444445 | 51.951 |
| 0.7763888888888889 | 51.951 |
| 0.7770833333333332 | 51.951 |
| 0.7777777777777778 | 51.951 |
| 0.7784722222222222 | 47.511 |
| 0.7791666666666667 | 47.511 |
| 0.779861111111111 | 47.511 |
| 0.7805555555555556 | 47.511 |
| 0.78125 | 47.511 |
| 0.7819444444444444 | 47.511 |
| 0.782638888888889 | 43.079 |
| 0.7833333333333333 | 43.079 |
| 0.7840277777777778 | 43.079 |
| 0.7847222222222222 | 43.079 |
| 0.7854166666666668 | 43.079 |
| 0.7861111111111111 | 43.079 |
| 0.7868055555555555 | 38.653 |
| 0.7875 | 38.653 |
| 0.7881944444444445 | 38.653 |
| 0.7888888888888889 | 38.653 |
| 0.7895833333333333 | 38.653 |
| 0.7902777777777777 | 38.653 |
| 0.7909722222222223 | 38.653 |
| 0.7916666666666666 | 34.234 |
| 0.7923611111111111 | 34.234 |
| 0.7930555555555556 | 34.234 |
| 0.7937500000000001 | 34.234 |
| 0.7944444444444444 | 34.234 |
| 0.7951388888888888 | 34.234 |
| 0.7958333333333334 | 34.234 |
| 0.7965277777777778 | 29.823 |
| 0.7972222222222222 | 29.823 |
| 0.7979166666666666 | 29.823 |
| 0.7986111111111112 | 29.823 |
| 0.7993055555555556 | 29.823 |
| 0.7999999999999999 | 29.823 |
| 0.8006944444444444 | 29.823 |
| 0.8013888888888889 | 29.823 |
| 0.8020833333333334 | 29.823 |
| 0.8027777777777777 | 29.823 |
| 0.8034722222222223 | 29.823 |
| 0.8041666666666667 | 25.419 |
| 0.8048611111111111 | 25.419 |
| 0.8055555555555555 | 25.419 |
| 0.80625 | 25.419 |
| 0.8069444444444445 | 25.419 |
| 0.8076388888888889 | 25.419 |
| 0.8083333333333332 | 21.024 |
| 0.8090277777777778 | 25.419 |
| 0.8097222222222222 | 21.024 |
| 0.8104166666666667 | 21.024 |
| 0.811111111111111 | 21.024 |
| 0.8118055555555556 | 16.636 |
| 0.8125 | 16.636 |
| 0.8131944444444444 | 16.636 |
| 0.813888888888889 | 16.636 |
| 0.8145833333333333 | 16.636 |
| 0.8152777777777778 | 16.636 |
| 0.8159722222222222 | 16.636 |
| 0.8166666666666668 | 12.257 |
| 0.8173611111111111 | 12.257 |
| 0.8180555555555555 | 12.257 |
| 0.81875 | 12.257 |
| 0.8194444444444445 | 12.257 |
| 0.8201388888888889 | 12.257 |
| 0.8208333333333333 | 12.257 |
| 0.8215277777777777 | 12.257 |
| 0.8222222222222223 | 12.257 |
| 0.8229166666666666 | 12.257 |
| 0.8236111111111111 | 12.257 |
| 0.8243055555555556 | 12.257 |
| 0.8250000000000001 | 7.887 |
| 0.8256944444444444 | 7.887 |
| 0.8263888888888888 | 7.887 |
| 0.8270833333333334 | 7.887 |
| 0.8277777777777778 | 7.887 |
| 0.8284722222222222 | 7.887 |
| 0.8291666666666666 | 7.887 |
| 0.8298611111111112 | 7.887 |
| 0.8305555555555556 | 3.525 |
| 0.8312499999999999 | 3.525 |
| 0.8319444444444444 | 3.525 |
| 0.8326388888888889 | 3.525 |
| 0.8333333333333334 | 3.525 |
| 0.8340277777777777 | 3.525 |
| 0.8347222222222223 | 3.525 |
| 0.8354166666666667 | 3.525 |
| 0.8361111111111111 | 3.525 |
| 0.8368055555555555 | 3.525 |
| 0.8375 | 3.525 |
| 0.8381944444444445 | 3.525 |
| 0.8388888888888889 | 0 |
| 0.8395833333333332 | 0 |
| 0.8402777777777778 | 0 |
| 0.8409722222222222 | 0 |
| 0.8416666666666667 | 0 |
| 0.842361111111111 | 0 |
| 0.8430555555555556 | 0 |
| 0.84375 | 0 |
| 0.8444444444444444 | 0 |
| 0.845138888888889 | 0 |
| 0.8458333333333333 | 0 |
| 0.8465277777777778 | 0 |
| 0.8472222222222222 | 0 |
| 0.8479166666666668 | 0 |
| 0.8486111111111111 | 0 |
| 0.8493055555555555 | 0 |
| 0.85 | 0 |
| 0.8506944444444445 | 0 |
| 0.8513888888888889 | 0 |
| 0.8520833333333333 | 0 |
| 0.8527777777777777 | 0 |
| 0.8534722222222223 | 0 |
| 0.8541666666666666 | 0 |
| 0.8548611111111111 | 0 |
| 0.8555555555555556 | 0 |
| 0.8562500000000001 | 0 |
| 0.8569444444444444 | 0 |
| 0.8576388888888888 | 0 |
| 0.8583333333333334 | 0 |
| 0.8590277777777778 | 0 |
| 0.8597222222222222 | 0 |
| 0.8604166666666666 | 0 |
| 0.8611111111111112 | 0 |
| 0.8618055555555556 | 0 |
| 0.8624999999999999 | 0 |
| 0.8631944444444444 | 0 |
| 0.8638888888888889 | 0 |
| 0.8645833333333334 | 0 |
| 0.8652777777777777 | 0 |
| 0.8659722222222223 | 0 |
| 0.8666666666666667 | 0 |
| 0.8673611111111111 | 0 |
| 0.8680555555555555 | 0 |
| 0.86875 | 0 |
| 0.8694444444444445 | 0 |
| 0.8701388888888889 | 0 |
| 0.8708333333333332 | 0 |
| 0.8715277777777778 | 0 |
| 0.8722222222222222 | 0 |
| 0.8729166666666667 | 0 |
| 0.873611111111111 | 0 |
| 0.8743055555555556 | 0 |
| 0.875 | 0 |
| 0.8756944444444444 | 0 |
| 0.876388888888889 | 0 |
| 0.8770833333333333 | 0 |
| 0.8777777777777778 | 0 |
| 0.8784722222222222 | 0 |
| 0.8791666666666668 | 0 |
| 0.8798611111111111 | 0 |
| 0.8805555555555555 | 0 |
| 0.88125 | 0 |
| 0.8819444444444445 | 0 |
| 0.8826388888888889 | 0 |
| 0.8833333333333333 | 0 |
| 0.8840277777777777 | 0 |
| 0.8847222222222223 | 0 |
| 0.8854166666666666 | 0 |
| 0.8861111111111111 | 0 |
| 0.8868055555555556 | 0 |
| 0.8875000000000001 | 0 |
| 0.8881944444444444 | 0 |
| 0.8888888888888888 | 0 |
| 0.8895833333333334 | 0 |
| 0.8902777777777778 | 0 |
| 0.8909722222222222 | 0 |
| 0.8916666666666666 | 0 |
| 0.8923611111111112 | 0 |
| 0.8930555555555556 | 0 |
| 0.8937499999999999 | 0 |
| 0.8944444444444444 | 0 |
| 0.8951388888888889 | 0 |
| 0.8958333333333334 | 0 |
| 0.8965277777777777 | 0 |
| 0.8972222222222223 | 0 |
| 0.8979166666666667 | 0 |
| 0.8986111111111111 | 0 |
| 0.8993055555555555 | 0 |
| 0.9 | 0 |
| 0.9006944444444445 | 0 |
| 0.9013888888888889 | 0 |
| 0.9020833333333332 | 0 |
| 0.9027777777777778 | 0 |
| 0.9034722222222222 | 0 |
| 0.9041666666666667 | 0 |
| 0.904861111111111 | 0 |
| 0.9055555555555556 | 0 |
| 0.90625 | 0 |
| 0.9069444444444444 | 0 |
| 0.907638888888889 | 0 |
| 0.9083333333333333 | 0 |
| 0.9090277777777778 | 0 |
| 0.9097222222222222 | 0 |
| 0.9104166666666668 | 0 |
| 0.9111111111111111 | 0 |
| 0.9118055555555555 | 0 |
| 0.9125 | 0 |
| 0.9131944444444445 | 0 |
| 0.9138888888888889 | 0 |
| 0.9145833333333333 | 0 |
| 0.9152777777777777 | 0 |
| 0.9159722222222223 | 0 |
| 0.9166666666666666 | 0 |
| 0.9173611111111111 | 0 |
| 0.9180555555555556 | 0 |
| 0.9187500000000001 | 0 |
| 0.9194444444444444 | 0 |
| 0.9201388888888888 | 0 |
| 0.9208333333333334 | 0 |
| 0.9215277777777778 | 0 |
| 0.9222222222222222 | 0 |
| 0.9229166666666666 | 0 |
| 0.9236111111111112 | 0 |
| 0.9243055555555556 | 0 |
| 0.9249999999999999 | 0 |
| 0.9256944444444444 | 0 |
| 0.9263888888888889 | 0 |
| 0.9270833333333334 | 0 |
| 0.9277777777777777 | 0 |
| 0.9284722222222223 | 0 |
| 0.9291666666666667 | 0 |
| 0.9298611111111111 | 0 |
| 0.9305555555555555 | 0 |
| 0.93125 | 0 |
| 0.9319444444444445 | 0 |
| 0.9326388888888889 | 0 |
| 0.9333333333333332 | 0 |
| 0.9340277777777778 | 0 |
| 0.9347222222222222 | 0 |
| 0.9354166666666667 | 0 |
| 0.936111111111111 | 0 |
| 0.9368055555555556 | 0 |
| 0.9375 | 0 |
| 0.9381944444444444 | 0 |
| 0.938888888888889 | 0 |
| 0.9395833333333333 | 0 |
| 0.9402777777777778 | 0 |
| 0.9409722222222222 | 0 |
| 0.9416666666666668 | 0 |
| 0.9423611111111111 | 0 |
| 0.9430555555555555 | 0 |
| 0.94375 | 0 |
| 0.9444444444444445 | 0 |
| 0.9451388888888889 | 0 |
| 0.9458333333333333 | 0 |
| 0.9465277777777777 | 0 |
| 0.9472222222222223 | 0 |
| 0.9479166666666666 | 0 |
| 0.9486111111111111 | 0 |
| 0.9493055555555556 | 0 |
| 0.9500000000000001 | 0 |
| 0.9506944444444444 | 0 |
| 0.9513888888888888 | 0 |
| 0.9520833333333334 | 0 |
| 0.9527777777777778 | 0 |
| 0.9534722222222222 | 0 |
| 0.9541666666666666 | 0 |
| 0.9548611111111112 | 0 |
| 0.9555555555555556 | 0 |
| 0.9562499999999999 | 0 |
| 0.9569444444444444 | 0 |
| 0.9576388888888889 | 0 |
| 0.9583333333333334 | 0 |
| 0.9590277777777777 | 0 |
| 0.9597222222222223 | 0 |
| 0.9604166666666667 | 0 |
| 0.9611111111111111 | 0 |
| 0.9618055555555555 | 0 |
| 0.9625 | 0 |
| 0.9631944444444445 | 0 |
| 0.9638888888888889 | 0 |
| 0.9645833333333332 | 0 |
| 0.9652777777777778 | 0 |
| 0.9659722222222222 | 0 |
| 0.9666666666666667 | 0 |
| 0.967361111111111 | 0 |
| 0.9680555555555556 | 0 |
| 0.96875 | 0 |
| 0.9694444444444444 | 0 |
| 0.970138888888889 | 0 |
| 0.9708333333333333 | 0 |
| 0.9715277777777778 | 0 |
| 0.9722222222222222 | 0 |
| 0.9729166666666668 | 0 |
| 0.9736111111111111 | 0 |
| 0.9743055555555555 | 0 |
| 0.975 | 0 |
| 0.9756944444444445 | 0 |
| 0.9763888888888889 | 0 |
| 0.9770833333333333 | 0 |
| 0.9777777777777777 | 0 |
| 0.9784722222222223 | 0 |
| 0.9791666666666666 | 0 |
| 0.9798611111111111 | 0 |
| 0.9805555555555556 | 0 |
| 0.9812500000000001 | 0 |
| 0.9819444444444444 | 0 |
| 0.9826388888888888 | 0 |
| 0.9833333333333334 | 0 |
| 0.9840277777777778 | 0 |
| 0.9847222222222222 | 0 |
| 0.9854166666666666 | 0 |
| 0.9861111111111112 | 0 |
| 0.9868055555555556 | 0 |
| 0.9874999999999999 | 0 |
| 0.9881944444444444 | 0 |
| 0.9888888888888889 | 0 |
| 0.9895833333333334 | 0 |
| 0.9902777777777777 | 0 |
| 0.9909722222222223 | 0 |
| 0.9916666666666667 | 0 |
| 0.9923611111111111 | 0 |
| 0.9930555555555555 | 0 |
| 0.99375 | 0 |
| 0.9944444444444445 | 0 |
| 0.9951388888888889 | 0 |
| 0.9958333333333332 | 0 |
| 0.9965277777777778 | 0 |
| 0.9972222222222222 | 0 |
| 0.9979166666666667 | 0 |
| 0.998611111111111 | 0 |
| 0.9993055555555556 | 0 |